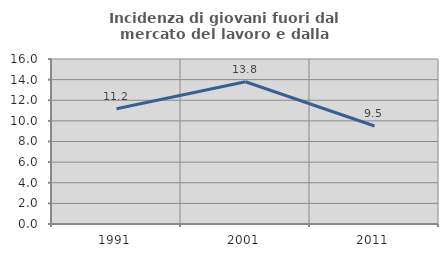
| Category | Incidenza di giovani fuori dal mercato del lavoro e dalla formazione  |
|---|---|
| 1991.0 | 11.169 |
| 2001.0 | 13.793 |
| 2011.0 | 9.504 |